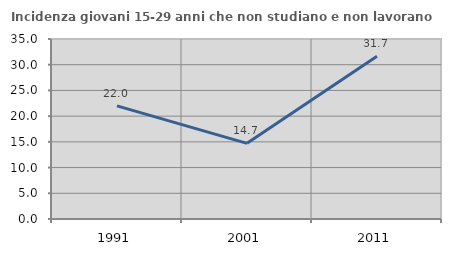
| Category | Incidenza giovani 15-29 anni che non studiano e non lavorano  |
|---|---|
| 1991.0 | 22 |
| 2001.0 | 14.706 |
| 2011.0 | 31.667 |